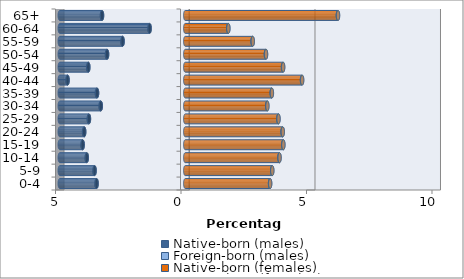
| Category | Native-born (males) | Foreign-born (males) | Native-born (females) | Foreign-born (females) |
|---|---|---|---|---|
| 0-4 | -3.532 | -0.006 | 3.378 | 0.005 |
| 5-9 | -3.611 | -0.004 | 3.463 | 0.004 |
| 10-14 | -3.922 | -0.005 | 3.752 | 0.004 |
| 15-19 | -4.086 | -0.006 | 3.904 | 0.006 |
| 20-24 | -4.026 | -0.007 | 3.878 | 0.007 |
| 25-29 | -3.837 | -0.008 | 3.708 | 0.009 |
| 30-34 | -3.364 | -0.009 | 3.264 | 0.01 |
| 35-39 | -3.514 | -0.009 | 3.443 | 0.009 |
| 40-44 | -4.688 | -0.009 | 4.651 | 0.009 |
| 45-49 | -3.861 | -0.008 | 3.895 | 0.007 |
| 50-54 | -3.114 | -0.006 | 3.214 | 0.006 |
| 55-59 | -2.495 | -0.005 | 2.684 | 0.005 |
| 60-64 | -1.419 | -0.005 | 1.713 | 0.004 |
| 65+ | -3.315 | -0.007 | 6.081 | 0.008 |